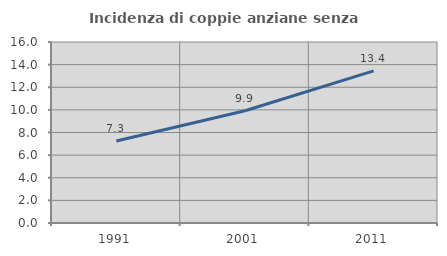
| Category | Incidenza di coppie anziane senza figli  |
|---|---|
| 1991.0 | 7.254 |
| 2001.0 | 9.925 |
| 2011.0 | 13.445 |